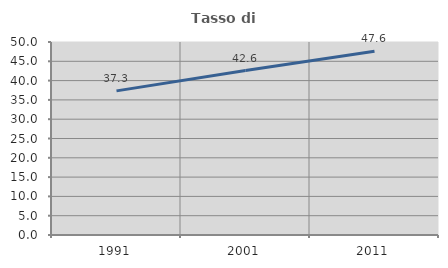
| Category | Tasso di occupazione   |
|---|---|
| 1991.0 | 37.338 |
| 2001.0 | 42.6 |
| 2011.0 | 47.601 |